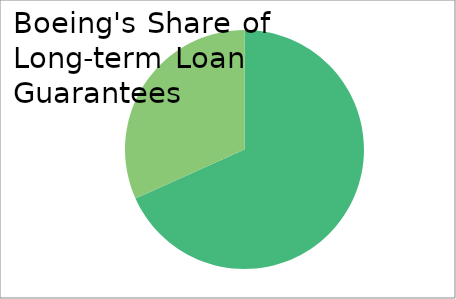
| Category | Series 0 |
|---|---|
| 0 | 7364834346 |
| 1 | 3421843539 |